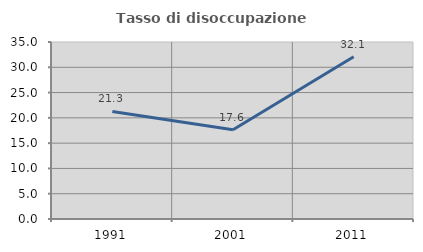
| Category | Tasso di disoccupazione giovanile  |
|---|---|
| 1991.0 | 21.277 |
| 2001.0 | 17.647 |
| 2011.0 | 32.075 |